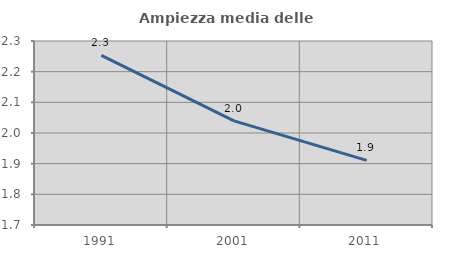
| Category | Ampiezza media delle famiglie |
|---|---|
| 1991.0 | 2.253 |
| 2001.0 | 2.04 |
| 2011.0 | 1.911 |